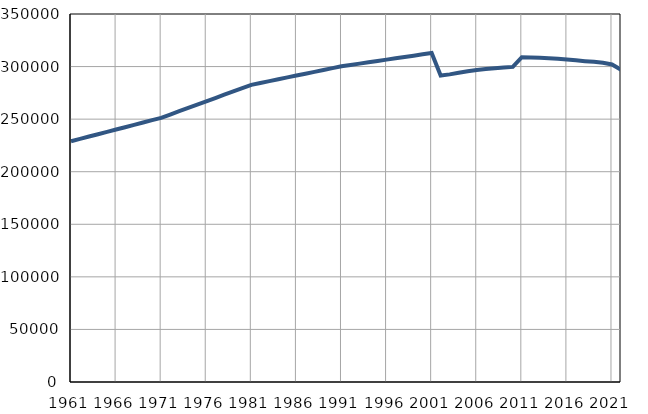
| Category | Population
size |
|---|---|
| 1961.0 | 228991 |
| 1962.0 | 231215 |
| 1963.0 | 233439 |
| 1964.0 | 235663 |
| 1965.0 | 237887 |
| 1966.0 | 240111 |
| 1967.0 | 242334 |
| 1968.0 | 244558 |
| 1969.0 | 246782 |
| 1970.0 | 249006 |
| 1971.0 | 251230 |
| 1972.0 | 254371 |
| 1973.0 | 257513 |
| 1974.0 | 260654 |
| 1975.0 | 263796 |
| 1976.0 | 266937 |
| 1977.0 | 270078 |
| 1978.0 | 273220 |
| 1979.0 | 276361 |
| 1980.0 | 279503 |
| 1981.0 | 282644 |
| 1982.0 | 284407 |
| 1983.0 | 286170 |
| 1984.0 | 287933 |
| 1985.0 | 289696 |
| 1986.0 | 291459 |
| 1987.0 | 293222 |
| 1988.0 | 294985 |
| 1989.0 | 296748 |
| 1990.0 | 298511 |
| 1991.0 | 300274 |
| 1992.0 | 301537 |
| 1993.0 | 302800 |
| 1994.0 | 304063 |
| 1995.0 | 305326 |
| 1996.0 | 306589 |
| 1997.0 | 307852 |
| 1998.0 | 309115 |
| 1999.0 | 310378 |
| 2000.0 | 311641 |
| 2001.0 | 312904 |
| 2002.0 | 291547 |
| 2003.0 | 292577 |
| 2004.0 | 294116 |
| 2005.0 | 295575 |
| 2006.0 | 296761 |
| 2007.0 | 297713 |
| 2008.0 | 298444 |
| 2009.0 | 299155 |
| 2010.0 | 299689 |
| 2011.0 | 308927 |
| 2012.0 | 308717 |
| 2013.0 | 308386 |
| 2014.0 | 308003 |
| 2015.0 | 307408 |
| 2016.0 | 306725 |
| 2017.0 | 305954 |
| 2018.0 | 305147 |
| 2019.0 | 304478 |
| 2020.0 | 303552 |
| 2021.0 | 302042 |
| 2022.0 | 297022 |